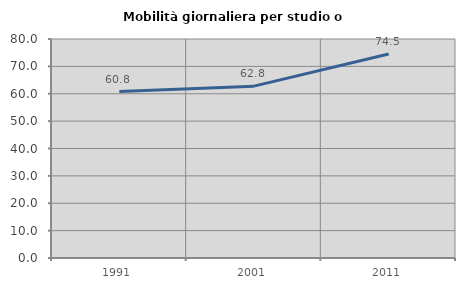
| Category | Mobilità giornaliera per studio o lavoro |
|---|---|
| 1991.0 | 60.813 |
| 2001.0 | 62.773 |
| 2011.0 | 74.496 |